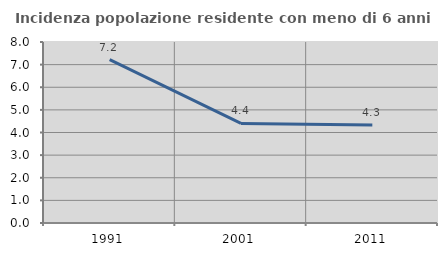
| Category | Incidenza popolazione residente con meno di 6 anni |
|---|---|
| 1991.0 | 7.219 |
| 2001.0 | 4.402 |
| 2011.0 | 4.337 |